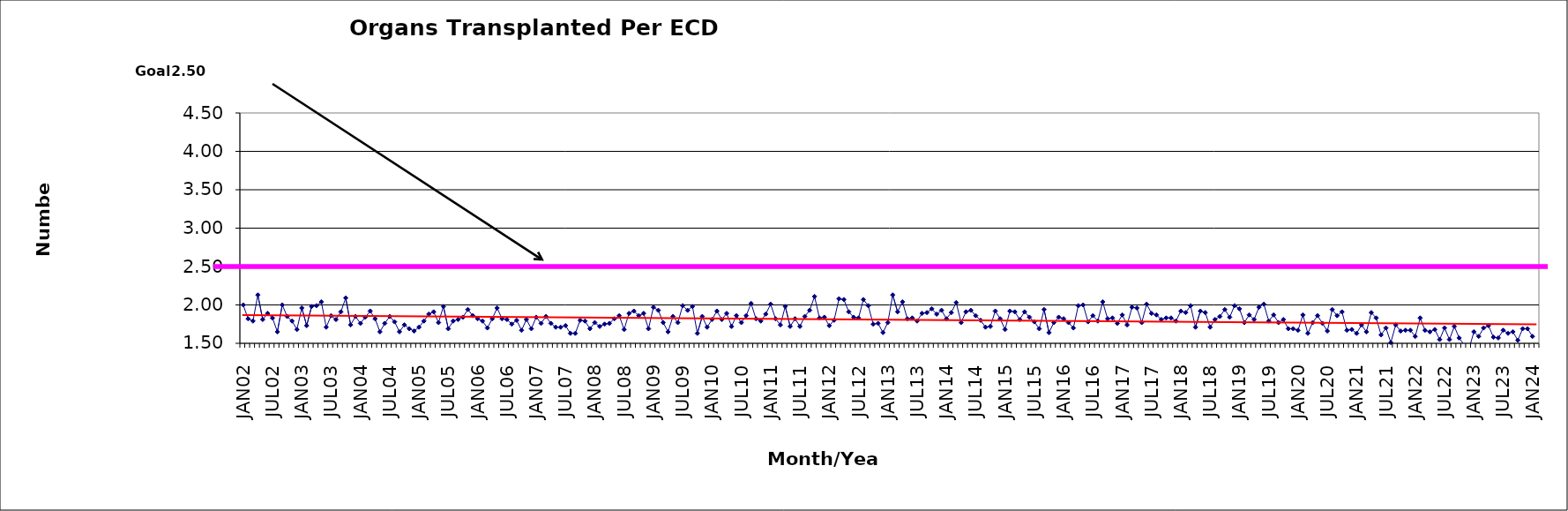
| Category | Series 0 |
|---|---|
| JAN02 | 2 |
| FEB02 | 1.82 |
| MAR02 | 1.79 |
| APR02 | 2.13 |
| MAY02 | 1.81 |
| JUN02 | 1.89 |
| JUL02 | 1.83 |
| AUG02 | 1.65 |
| SEP02 | 2 |
| OCT02 | 1.85 |
| NOV02 | 1.79 |
| DEC02 | 1.68 |
| JAN03 | 1.96 |
| FEB03 | 1.73 |
| MAR03 | 1.98 |
| APR03 | 1.99 |
| MAY03 | 2.04 |
| JUN03 | 1.71 |
| JUL03 | 1.86 |
| AUG03 | 1.81 |
| SEP03 | 1.91 |
| OCT03 | 2.09 |
| NOV03 | 1.74 |
| DEC03 | 1.85 |
| JAN04 | 1.76 |
| FEB04 | 1.84 |
| MAR04 | 1.92 |
| APR04 | 1.82 |
| MAY04 | 1.65 |
| JUN04 | 1.76 |
| JUL04 | 1.85 |
| AUG04 | 1.78 |
| SEP04 | 1.65 |
| OCT04 | 1.74 |
| NOV04 | 1.69 |
| DEC04 | 1.66 |
| JAN05 | 1.71 |
| FEB05 | 1.79 |
| MAR05 | 1.88 |
| APR05 | 1.91 |
| MAY05 | 1.77 |
| JUN05 | 1.98 |
| JUL05 | 1.69 |
| AUG05 | 1.79 |
| SEP05 | 1.81 |
| OCT05 | 1.84 |
| NOV05 | 1.94 |
| DEC05 | 1.86 |
| JAN06 | 1.82 |
| FEB06 | 1.79 |
| MAR06 | 1.7 |
| APR06 | 1.82 |
| MAY06 | 1.96 |
| JUN06 | 1.82 |
| JUL06 | 1.81 |
| AUG06 | 1.75 |
| SEP06 | 1.8 |
| OCT06 | 1.67 |
| NOV06 | 1.81 |
| DEC06 | 1.69 |
| JAN07 | 1.84 |
| FEB07 | 1.76 |
| MAR07 | 1.85 |
| APR07 | 1.76 |
| MAY07 | 1.71 |
| JUN07 | 1.71 |
| JUL07 | 1.73 |
| AUG07 | 1.63 |
| SEP07 | 1.63 |
| OCT07 | 1.8 |
| NOV07 | 1.79 |
| DEC07 | 1.69 |
| JAN08 | 1.77 |
| FEB08 | 1.72 |
| MAR08 | 1.75 |
| APR08 | 1.76 |
| MAY08 | 1.82 |
| JUN08 | 1.86 |
| JUL08 | 1.68 |
| AUG08 | 1.89 |
| SEP08 | 1.92 |
| OCT08 | 1.86 |
| NOV08 | 1.89 |
| DEC08 | 1.69 |
| JAN09 | 1.97 |
| FEB09 | 1.93 |
| MAR09 | 1.77 |
| APR09 | 1.65 |
| MAY09 | 1.85 |
| JUN09 | 1.77 |
| JUL09 | 1.99 |
| AUG09 | 1.93 |
| SEP09 | 1.98 |
| OCT09 | 1.63 |
| NOV09 | 1.85 |
| DEC09 | 1.71 |
| JAN10 | 1.81 |
| FEB10 | 1.92 |
| MAR10 | 1.81 |
| APR10 | 1.89 |
| MAY10 | 1.72 |
| JUN10 | 1.86 |
| JUL10 | 1.77 |
| AUG10 | 1.86 |
| SEP10 | 2.02 |
| OCT10 | 1.82 |
| NOV10 | 1.79 |
| DEC10 | 1.88 |
| JAN11 | 2.01 |
| FEB11 | 1.82 |
| MAR11 | 1.74 |
| APR11 | 1.98 |
| MAY11 | 1.72 |
| JUN11 | 1.82 |
| JUL11 | 1.72 |
| AUG11 | 1.85 |
| SEP11 | 1.93 |
| OCT11 | 2.11 |
| NOV11 | 1.83 |
| DEC11 | 1.84 |
| JAN12 | 1.73 |
| FEB12 | 1.8 |
| MAR12 | 2.08 |
| APR12 | 2.07 |
| MAY12 | 1.91 |
| JUN12 | 1.84 |
| JUL12 | 1.83 |
| AUG12 | 2.07 |
| SEP12 | 1.99 |
| OCT12 | 1.75 |
| NOV12 | 1.76 |
| DEC12 | 1.64 |
| JAN13 | 1.77 |
| FEB13 | 2.13 |
| MAR13 | 1.91 |
| APR13 | 2.04 |
| MAY13 | 1.82 |
| JUN13 | 1.83 |
| JUL13 | 1.79 |
| AUG13 | 1.89 |
| SEP13 | 1.9 |
| OCT13 | 1.95 |
| NOV13 | 1.88 |
| DEC13 | 1.93 |
| JAN14 | 1.82 |
| FEB14 | 1.9 |
| MAR14 | 2.03 |
| APR14 | 1.77 |
| MAY14 | 1.91 |
| JUN14 | 1.93 |
| JUL14 | 1.86 |
| AUG14 | 1.8 |
| SEP14 | 1.71 |
| OCT14 | 1.72 |
| NOV14 | 1.92 |
| DEC14 | 1.82 |
| JAN15 | 1.68 |
| FEB15 | 1.92 |
| MAR15 | 1.91 |
| APR15 | 1.81 |
| MAY15 | 1.91 |
| JUN15 | 1.84 |
| JUL15 | 1.78 |
| AUG15 | 1.69 |
| SEP15 | 1.94 |
| OCT15 | 1.64 |
| NOV15 | 1.77 |
| DEC15 | 1.84 |
| JAN16 | 1.82 |
| FEB16 | 1.77 |
| MAR16 | 1.7 |
| APR16 | 1.99 |
| MAY16 | 2 |
| JUN16 | 1.78 |
| JUL16 | 1.86 |
| AUG16 | 1.79 |
| SEP16 | 2.04 |
| OCT16 | 1.82 |
| NOV16 | 1.83 |
| DEC16 | 1.76 |
| JAN17 | 1.87 |
| FEB17 | 1.74 |
| MAR17 | 1.97 |
| APR17 | 1.96 |
| MAY17 | 1.77 |
| JUN17 | 2.01 |
| JUL17 | 1.89 |
| AUG17 | 1.87 |
| SEP17 | 1.81 |
| OCT17 | 1.83 |
| NOV17 | 1.83 |
| DEC17 | 1.79 |
| JAN18 | 1.92 |
| FEB18 | 1.9 |
| MAR18 | 1.99 |
| APR18 | 1.71 |
| MAY18 | 1.92 |
| JUN18 | 1.9 |
| JUL18 | 1.71 |
| AUG18 | 1.81 |
| SEP18 | 1.85 |
| OCT18 | 1.94 |
| NOV18 | 1.84 |
| DEC18 | 1.99 |
| JAN19 | 1.95 |
| FEB19 | 1.77 |
| MAR19 | 1.87 |
| APR19 | 1.81 |
| MAY19 | 1.97 |
| JUN19 | 2.01 |
| JUL19 | 1.79 |
| AUG19 | 1.87 |
| SEP19 | 1.77 |
| OCT19 | 1.81 |
| NOV19 | 1.69 |
| DEC19 | 1.69 |
| JAN20 | 1.67 |
| FEB20 | 1.87 |
| MAR20 | 1.63 |
| APR20 | 1.77 |
| MAY20 | 1.86 |
| JUN20 | 1.76 |
| JUL20 | 1.66 |
| AUG20 | 1.94 |
| SEP20 | 1.86 |
| OCT20 | 1.91 |
| NOV20 | 1.67 |
| DEC20 | 1.68 |
| JAN21 | 1.63 |
| FEB21 | 1.74 |
| MAR21 | 1.65 |
| APR21 | 1.9 |
| MAY21 | 1.83 |
| JUN21 | 1.61 |
| JUL21 | 1.7 |
| AUG21 | 1.51 |
| SEP21 | 1.74 |
| OCT21 | 1.66 |
| NOV21 | 1.67 |
| DEC21 | 1.67 |
| JAN22 | 1.59 |
| FEB22 | 1.83 |
| MAR22 | 1.67 |
| APR22 | 1.65 |
| MAY22 | 1.68 |
| JUN22 | 1.55 |
| JUL22 | 1.7 |
| AUG22 | 1.55 |
| SEP22 | 1.72 |
| OCT22 | 1.57 |
| NOV22 | 1.48 |
| DEC22 | 1.42 |
| JAN23 | 1.65 |
| FEB23 | 1.59 |
| MAR23 | 1.7 |
| APR23 | 1.73 |
| MAY23 | 1.58 |
| JUN23 | 1.57 |
| JUL23 | 1.67 |
| AUG23 | 1.63 |
| SEP23 | 1.65 |
| OCT23 | 1.54 |
| NOV23 | 1.69 |
| DEC23 | 1.69 |
| JAN24 | 1.59 |